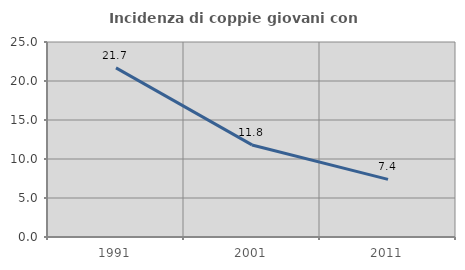
| Category | Incidenza di coppie giovani con figli |
|---|---|
| 1991.0 | 21.683 |
| 2001.0 | 11.805 |
| 2011.0 | 7.389 |